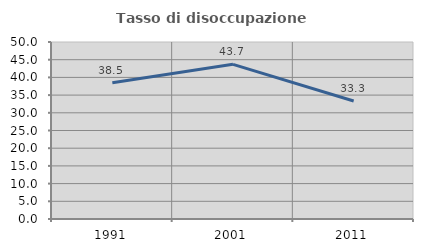
| Category | Tasso di disoccupazione giovanile  |
|---|---|
| 1991.0 | 38.462 |
| 2001.0 | 43.697 |
| 2011.0 | 33.333 |